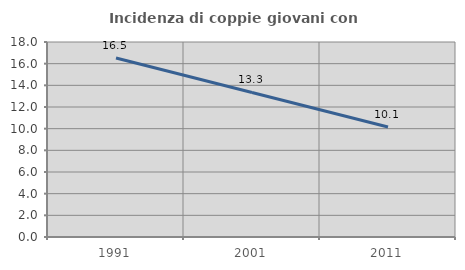
| Category | Incidenza di coppie giovani con figli |
|---|---|
| 1991.0 | 16.517 |
| 2001.0 | 13.345 |
| 2011.0 | 10.147 |